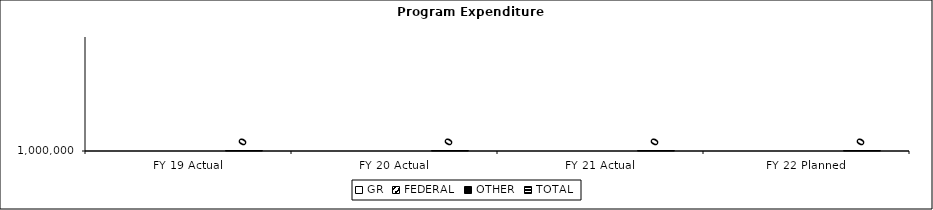
| Category | GR | FEDERAL | OTHER | TOTAL |
|---|---|---|---|---|
| FY 19 Actual |  |  |  | 0 |
| FY 20 Actual |  |  |  | 0 |
| FY 21 Actual |  |  |  | 0 |
| FY 22 Planned |  |  |  | 0 |